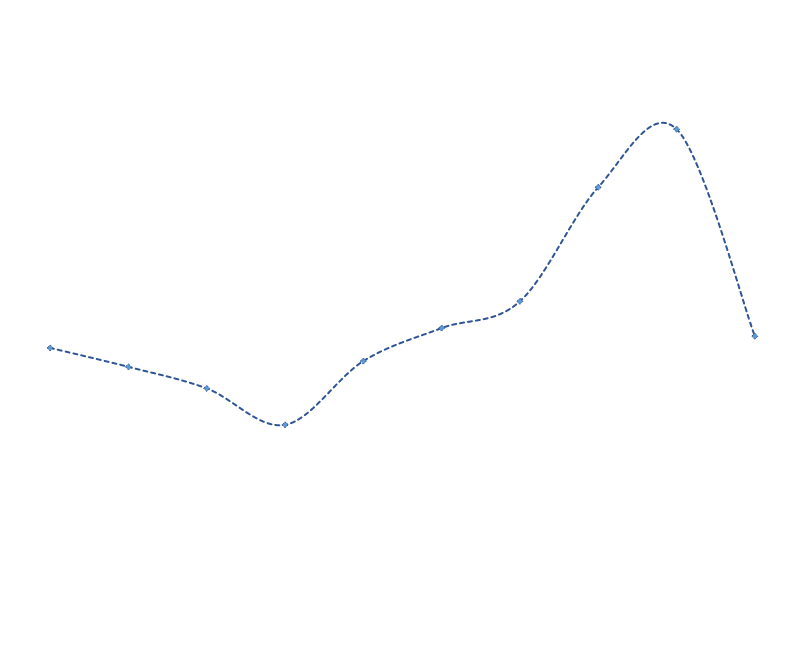
| Category | Series 0 |
|---|---|
| 0 | 19145.187 |
| 1 | 19007.33 |
| 2 | 18850.739 |
| 3 | 18585.805 |
| 4 | 19049.461 |
| 5 | 19289.339 |
| 6 | 19484.085 |
| 7 | 20313.602 |
| 8 | 20735.54 |
| 9 | 19230.344 |